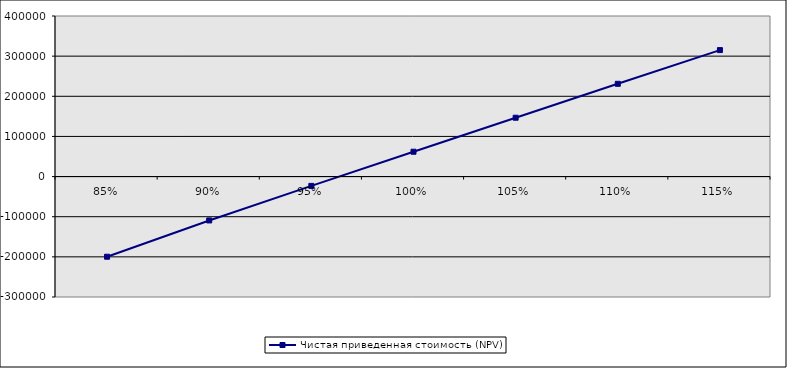
| Category | Чистая приведенная стоимость (NPV) |
|---|---|
| 0.85 | -199685.189 |
| 0.9 | -109279.867 |
| 0.9500000000000001 | -23231.699 |
| 1.0 | 61910.27 |
| 1.05 | 146585.677 |
| 1.1 | 231057.947 |
| 1.1500000000000001 | 315046.547 |